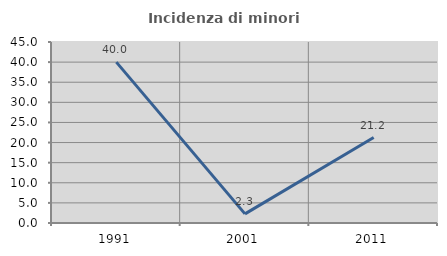
| Category | Incidenza di minori stranieri |
|---|---|
| 1991.0 | 40 |
| 2001.0 | 2.273 |
| 2011.0 | 21.239 |